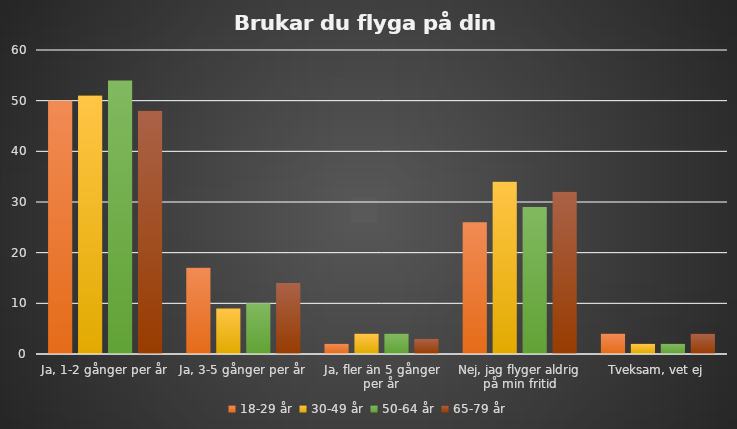
| Category | 18-29 år | 30-49 år | 50-64 år | 65-79 år |
|---|---|---|---|---|
| Ja, 1-2 gånger per år | 50 | 51 | 54 | 48 |
| Ja, 3-5 gånger per år | 17 | 9 | 10 | 14 |
| Ja, fler än 5 gånger per år | 2 | 4 | 4 | 3 |
| Nej, jag flyger aldrig på min fritid | 26 | 34 | 29 | 32 |
| Tveksam, vet ej | 4 | 2 | 2 | 4 |